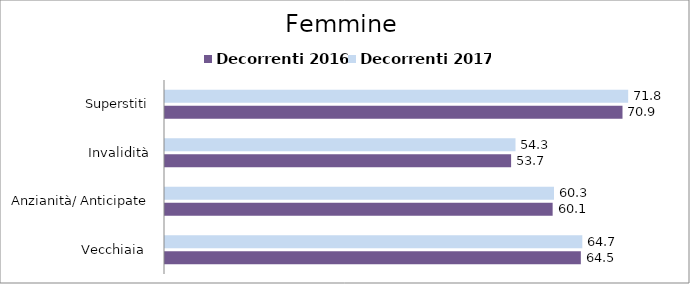
| Category | Decorrenti 2016 | Decorrenti 2017 |
|---|---|---|
| Vecchiaia  | 64.47 | 64.7 |
| Anzianità/ Anticipate | 60.1 | 60.31 |
| Invalidità | 53.66 | 54.34 |
| Superstiti | 70.93 | 71.81 |